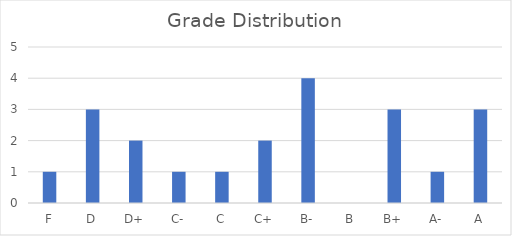
| Category | Series 0 |
|---|---|
| F | 1 |
| D | 3 |
| D+ | 2 |
| C- | 1 |
| C | 1 |
| C+ | 2 |
| B- | 4 |
| B | 0 |
| B+ | 3 |
| A- | 1 |
| A | 3 |